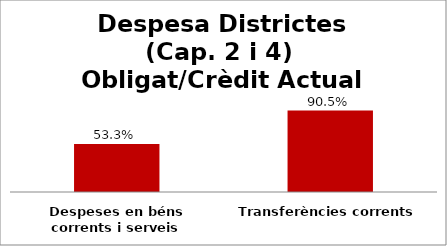
| Category | Series 0 |
|---|---|
| Despeses en béns corrents i serveis | 0.533 |
| Transferències corrents | 0.905 |